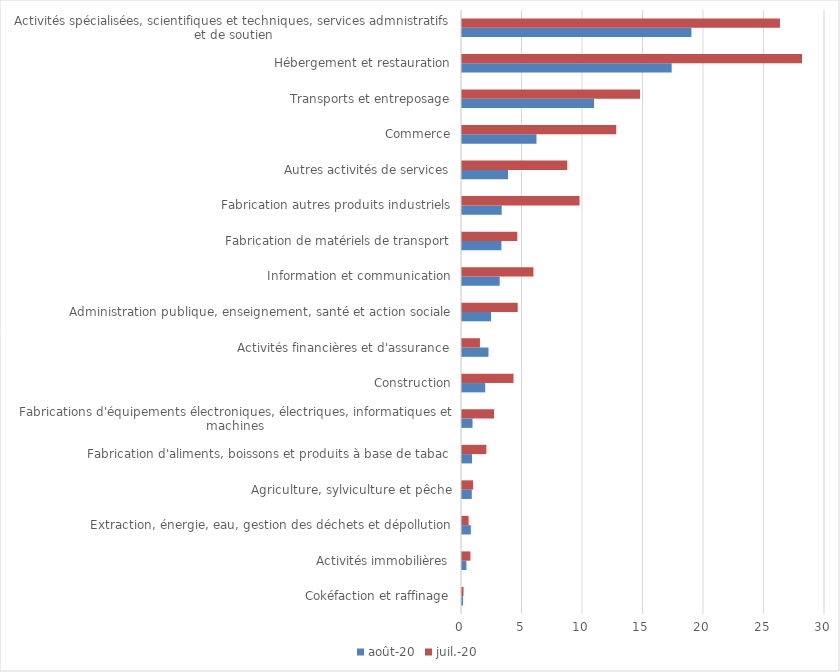
| Category | août-20 | juil.-20 |
|---|---|---|
| Cokéfaction et raffinage | 0.082 | 0.123 |
| Activités immobilières | 0.365 | 0.696 |
| Extraction, énergie, eau, gestion des déchets et dépollution | 0.727 | 0.548 |
| Agriculture, sylviculture et pêche | 0.808 | 0.91 |
| Fabrication d'aliments, boissons et produits à base de tabac | 0.831 | 2.014 |
| Fabrications d'équipements électroniques, électriques, informatiques et machines | 0.869 | 2.651 |
| Construction | 1.916 | 4.255 |
| Activités financières et d'assurance | 2.189 | 1.483 |
| Administration publique, enseignement, santé et action sociale | 2.398 | 4.604 |
| Information et communication | 3.114 | 5.902 |
| Fabrication de matériels de transport | 3.257 | 4.565 |
| Fabrication autres produits industriels | 3.28 | 9.714 |
| Autres activités de services | 3.808 | 8.693 |
| Commerce | 6.154 | 12.748 |
| Transports et entreposage | 10.914 | 14.714 |
| Hébergement et restauration | 17.328 | 28.101 |
| Activités spécialisées, scientifiques et techniques, services admnistratifs et de soutien | 18.961 | 26.276 |